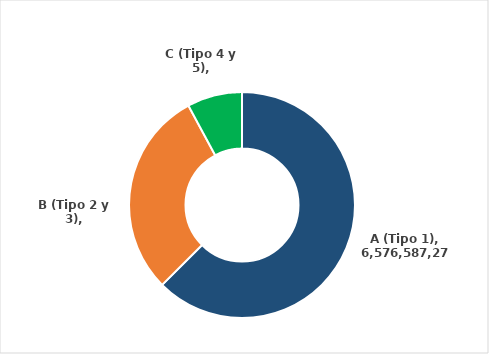
| Category | Series 0 |
|---|---|
| A (Tipo 1) | 6576587271.69 |
| B (Tipo 2 y 3) | 3118445768.55 |
| C (Tipo 4 y 5) | 827908739.76 |